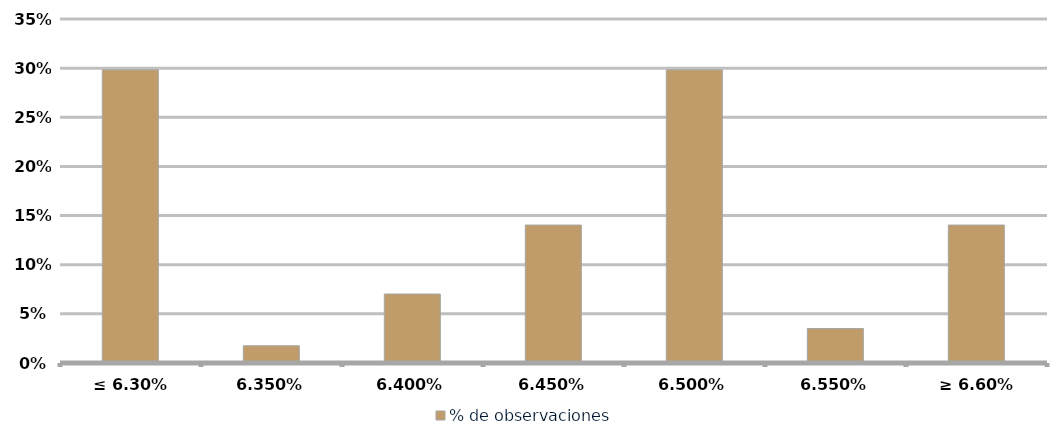
| Category | % de observaciones  |
|---|---|
| ≤ 6.30% | 0.298 |
| 6.35% | 0.018 |
| 6.40% | 0.07 |
| 6.45% | 0.14 |
| 6.50% | 0.298 |
| 6.55% | 0.035 |
| ≥ 6.60% | 0.14 |